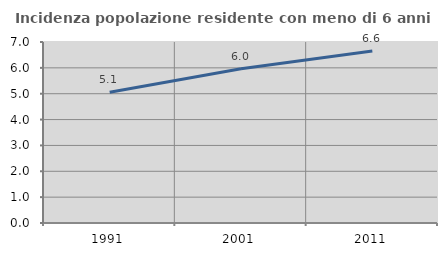
| Category | Incidenza popolazione residente con meno di 6 anni |
|---|---|
| 1991.0 | 5.06 |
| 2001.0 | 5.966 |
| 2011.0 | 6.65 |